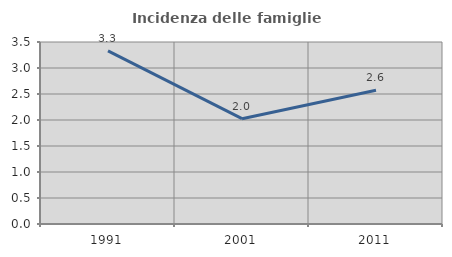
| Category | Incidenza delle famiglie numerose |
|---|---|
| 1991.0 | 3.328 |
| 2001.0 | 2.026 |
| 2011.0 | 2.573 |